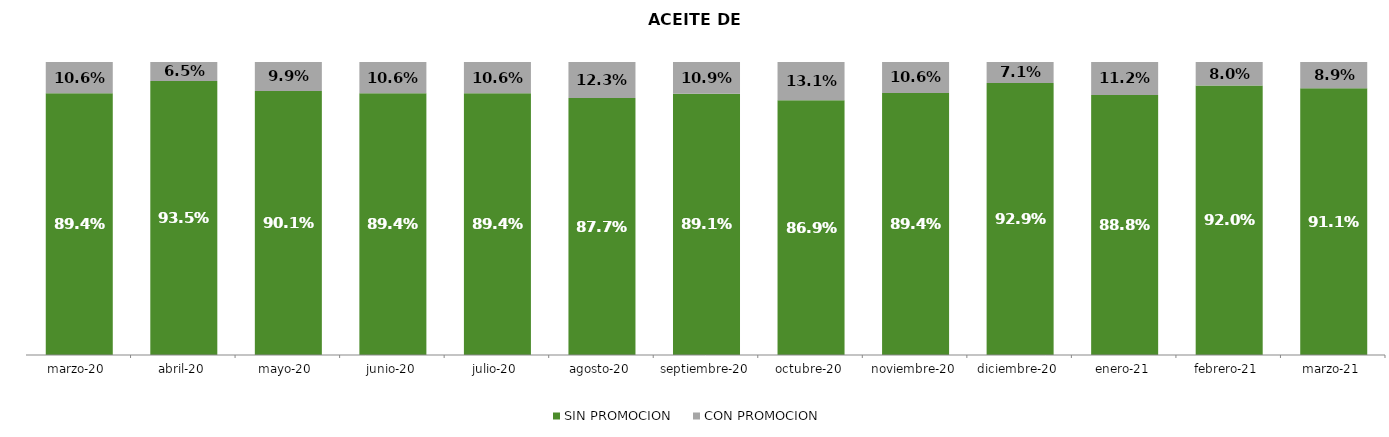
| Category | SIN PROMOCION   | CON PROMOCION   |
|---|---|---|
| 2020-03-01 | 0.894 | 0.106 |
| 2020-04-01 | 0.935 | 0.065 |
| 2020-05-01 | 0.901 | 0.099 |
| 2020-06-01 | 0.894 | 0.106 |
| 2020-07-01 | 0.894 | 0.106 |
| 2020-08-01 | 0.877 | 0.123 |
| 2020-09-01 | 0.891 | 0.109 |
| 2020-10-01 | 0.869 | 0.131 |
| 2020-11-01 | 0.894 | 0.106 |
| 2020-12-01 | 0.929 | 0.071 |
| 2021-01-01 | 0.888 | 0.112 |
| 2021-02-01 | 0.92 | 0.08 |
| 2021-03-01 | 0.911 | 0.089 |